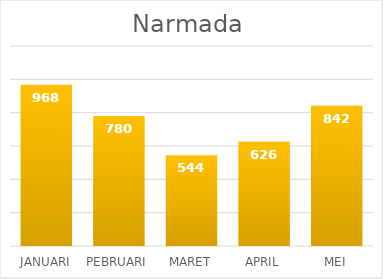
| Category |  968  |
|---|---|
| JANUARI | 968 |
| PEBRUARI | 780 |
| MARET | 544 |
| APRIL | 626 |
| MEI | 842 |